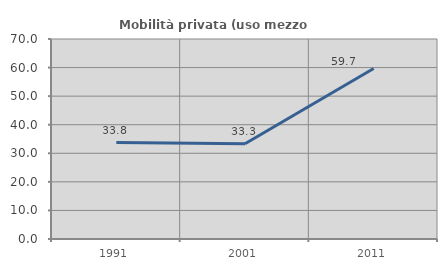
| Category | Mobilità privata (uso mezzo privato) |
|---|---|
| 1991.0 | 33.766 |
| 2001.0 | 33.333 |
| 2011.0 | 59.664 |